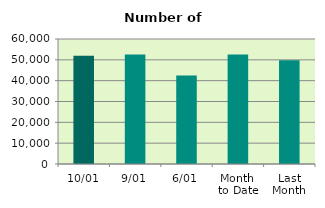
| Category | Series 0 |
|---|---|
| 10/01 | 51944 |
| 9/01 | 52608 |
| 6/01 | 42472 |
| Month 
to Date | 52578.333 |
| Last
Month | 49764 |